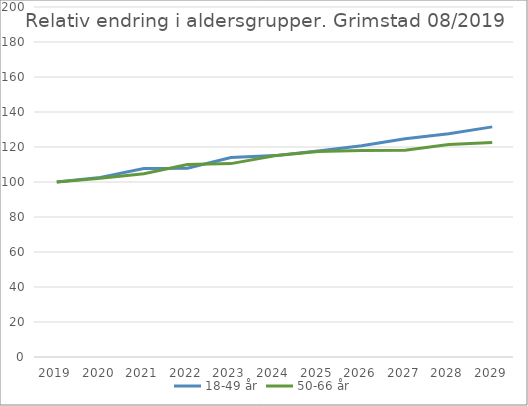
| Category | 18-49 år | 50-66 år |
|---|---|---|
| 2019 | 100 | 100 |
| 2020 | 102.643 | 102.177 |
| 2021 | 107.752 | 104.719 |
| 2022 | 107.913 | 109.998 |
| 2023 | 114.034 | 110.51 |
| 2024 | 115.076 | 114.959 |
| 2025 | 117.768 | 117.44 |
| 2026 | 120.667 | 117.952 |
| 2027 | 124.658 | 118.201 |
| 2028 | 127.54 | 121.477 |
| 2029 | 131.503 | 122.594 |